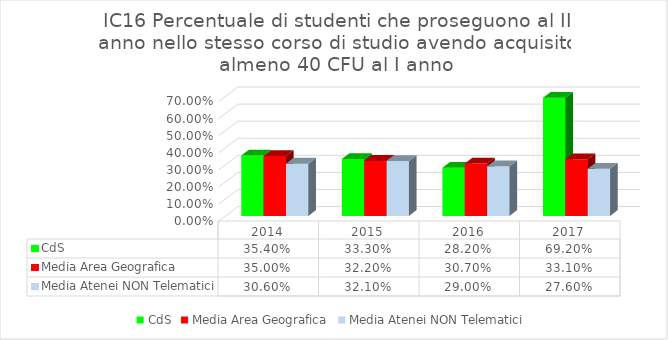
| Category | CdS | Media Area Geografica | Media Atenei NON Telematici |
|---|---|---|---|
| 2014.0 | 0.354 | 0.35 | 0.306 |
| 2015.0 | 0.333 | 0.322 | 0.321 |
| 2016.0 | 0.282 | 0.307 | 0.29 |
| 2017.0 | 0.692 | 0.331 | 0.276 |